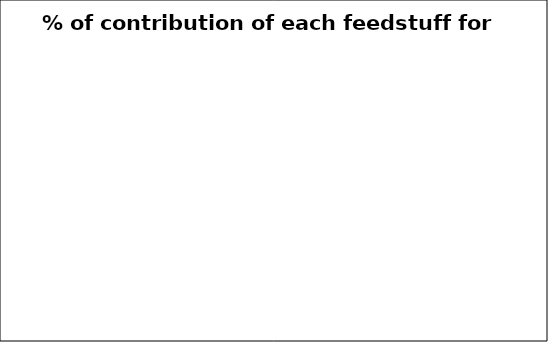
| Category | % of contribution off each feedstuff for Methionine |
|---|---|
| 0.0 | 0 |
| 0.0 | 0 |
| 0.0 | 0 |
| 0.0 | 0 |
| 0.0 | 0 |
| 0.0 | 0 |
| 0.0 | 0 |
| 0.0 | 0 |
| 0.0 | 0 |
| 0.0 | 0 |
| 0.0 | 0 |
| 0.0 | 0 |